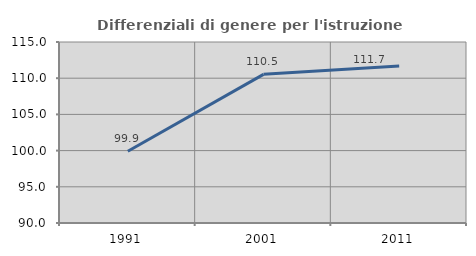
| Category | Differenziali di genere per l'istruzione superiore |
|---|---|
| 1991.0 | 99.901 |
| 2001.0 | 110.535 |
| 2011.0 | 111.675 |